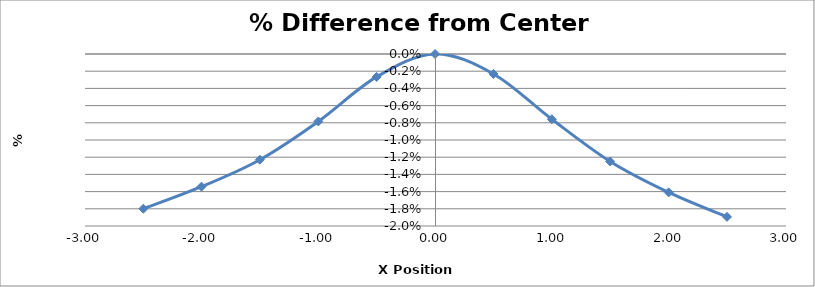
| Category | Series 0 |
|---|---|
| -2.5010000000000003 | -0.018 |
| -2.003 | -0.015 |
| -1.5030000000000001 | -0.012 |
| -1.0030000000000001 | -0.008 |
| -0.5040000000000004 | -0.003 |
| -0.004000000000000448 | 0 |
| 0.49599999999999955 | -0.002 |
| 0.9959999999999996 | -0.008 |
| 1.495 | -0.012 |
| 1.9959999999999996 | -0.016 |
| 2.495 | -0.019 |